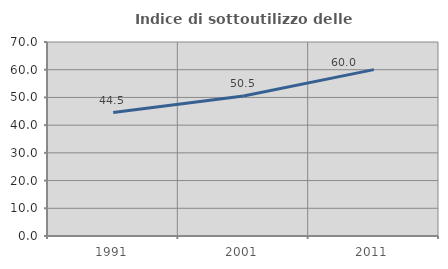
| Category | Indice di sottoutilizzo delle abitazioni  |
|---|---|
| 1991.0 | 44.538 |
| 2001.0 | 50.542 |
| 2011.0 | 60.04 |